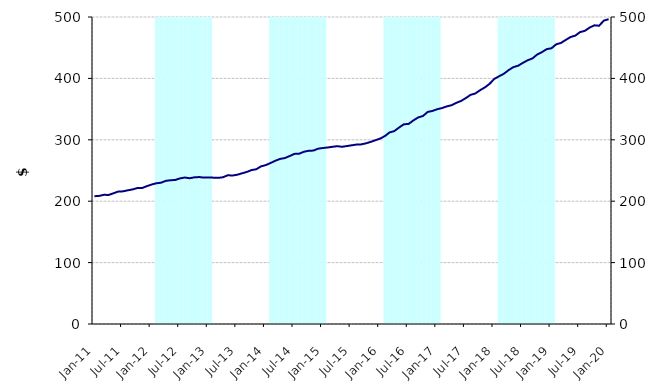
| Category | Series 1 |
|---|---|
| 2011-01-01 | 0 |
| 2011-02-01 | 0 |
| 2011-03-01 | 0 |
| 2011-04-01 | 0 |
| 2011-05-01 | 0 |
| 2011-06-01 | 0 |
| 2011-07-01 | 0 |
| 2011-08-01 | 0 |
| 2011-09-01 | 0 |
| 2011-10-01 | 0 |
| 2011-11-01 | 0 |
| 2011-12-01 | 0 |
| 2012-01-01 | 0 |
| 2012-02-01 | 500000000 |
| 2012-03-01 | 500000000 |
| 2012-04-01 | 500000000 |
| 2012-05-01 | 500000000 |
| 2012-06-01 | 500000000 |
| 2012-07-01 | 500000000 |
| 2012-08-01 | 500000000 |
| 2012-09-01 | 500000000 |
| 2012-10-01 | 500000000 |
| 2012-11-01 | 500000000 |
| 2012-12-01 | 500000000 |
| 2013-01-01 | 500000000 |
| 2013-02-01 | 0 |
| 2013-03-01 | 0 |
| 2013-04-01 | 0 |
| 2013-05-01 | 0 |
| 2013-06-01 | 0 |
| 2013-07-01 | 0 |
| 2013-08-01 | 0 |
| 2013-09-01 | 0 |
| 2013-10-01 | 0 |
| 2013-11-01 | 0 |
| 2013-12-01 | 0 |
| 2014-01-01 | 0 |
| 2014-02-01 | 500000000 |
| 2014-03-01 | 500000000 |
| 2014-04-01 | 500000000 |
| 2014-05-01 | 500000000 |
| 2014-06-01 | 500000000 |
| 2014-07-01 | 500000000 |
| 2014-08-01 | 500000000 |
| 2014-09-01 | 500000000 |
| 2014-10-01 | 500000000 |
| 2014-11-01 | 500000000 |
| 2014-12-01 | 500000000 |
| 2015-01-01 | 500000000 |
| 2015-02-01 | 0 |
| 2015-03-01 | 0 |
| 2015-04-01 | 0 |
| 2015-05-01 | 0 |
| 2015-06-01 | 0 |
| 2015-07-01 | 0 |
| 2015-08-01 | 0 |
| 2015-09-01 | 0 |
| 2015-10-01 | 0 |
| 2015-11-01 | 0 |
| 2015-12-01 | 0 |
| 2016-01-01 | 0 |
| 2016-02-01 | 500000000 |
| 2016-03-01 | 500000000 |
| 2016-04-01 | 500000000 |
| 2016-05-01 | 500000000 |
| 2016-06-01 | 500000000 |
| 2016-07-01 | 500000000 |
| 2016-08-01 | 500000000 |
| 2016-09-01 | 500000000 |
| 2016-10-01 | 500000000 |
| 2016-11-01 | 500000000 |
| 2016-12-01 | 500000000 |
| 2017-01-01 | 500000000 |
| 2017-02-01 | 0 |
| 2017-03-01 | 0 |
| 2017-04-01 | 0 |
| 2017-05-01 | 0 |
| 2017-06-01 | 0 |
| 2017-07-01 | 0 |
| 2017-08-01 | 0 |
| 2017-09-01 | 0 |
| 2017-10-01 | 0 |
| 2017-11-01 | 0 |
| 2017-12-01 | 0 |
| 2018-01-01 | 0 |
| 2018-02-01 | 500000000 |
| 2018-03-01 | 500000000 |
| 2018-04-01 | 500000000 |
| 2018-05-01 | 500000000 |
| 2018-06-01 | 500000000 |
| 2018-07-01 | 500000000 |
| 2018-08-01 | 500000000 |
| 2018-09-01 | 500000000 |
| 2018-10-01 | 500000000 |
| 2018-11-01 | 500000000 |
| 2018-12-01 | 500000000 |
| 2019-01-01 | 500000000 |
| 2019-02-01 | 0 |
| 2019-03-01 | 0 |
| 2019-04-01 | 0 |
| 2019-05-01 | 0 |
| 2019-06-01 | 0 |
| 2019-07-01 | 0 |
| 2019-08-01 | 0 |
| 2019-09-01 | 0 |
| 2019-10-01 | 0 |
| 2019-11-01 | 0 |
| 2019-12-01 | 0 |
| 2020-01-01 | 0 |